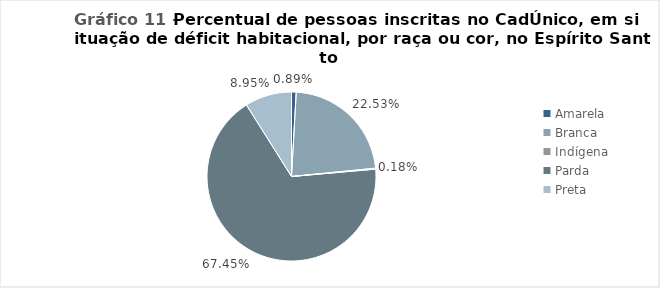
| Category | Series 0 |
|---|---|
| Amarela | 0.009 |
| Branca | 0.225 |
| Indígena | 0.002 |
| Parda | 0.674 |
| Preta | 0.089 |